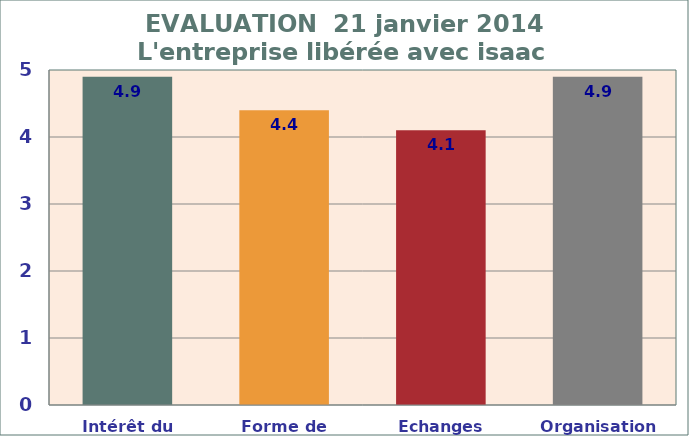
| Category | Series 0 |
|---|---|
| Intérêt du sujet | 4.9 |
| Forme de l'intervention | 4.4 |
| Echanges Participants | 4.1 |
| Organisation Intervention | 4.9 |